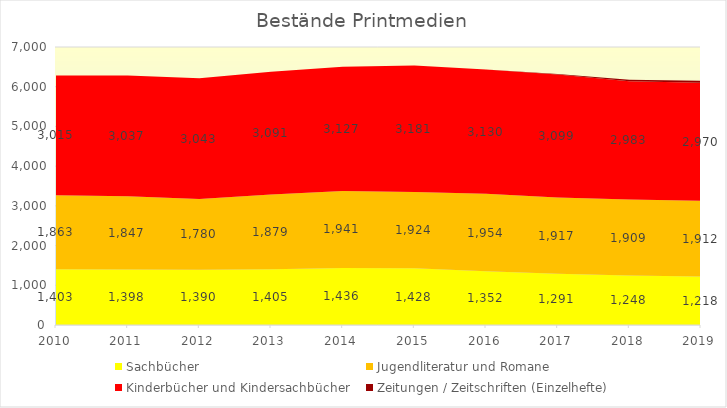
| Category | Sachbücher | Jugendliteratur und Romane | Kinderbücher und Kindersachbücher | Zeitungen / Zeitschriften (Einzelhefte) |
|---|---|---|---|---|
| 2010.0 | 1403 | 1863 | 3015 | 0 |
| 2011.0 | 1398 | 1847 | 3037 | 0 |
| 2012.0 | 1390 | 1780 | 3043 | 0 |
| 2013.0 | 1405 | 1879 | 3091 | 0 |
| 2014.0 | 1436 | 1941 | 3127 | 0 |
| 2015.0 | 1428 | 1924 | 3181 | 0 |
| 2016.0 | 1352 | 1954 | 3130 | 0 |
| 2017.0 | 1291 | 1917 | 3099 | 15 |
| 2018.0 | 1248 | 1909 | 2983 | 33 |
| 2019.0 | 1218 | 1912 | 2970 | 47 |